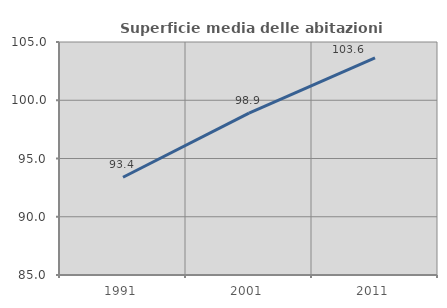
| Category | Superficie media delle abitazioni occupate |
|---|---|
| 1991.0 | 93.389 |
| 2001.0 | 98.889 |
| 2011.0 | 103.628 |